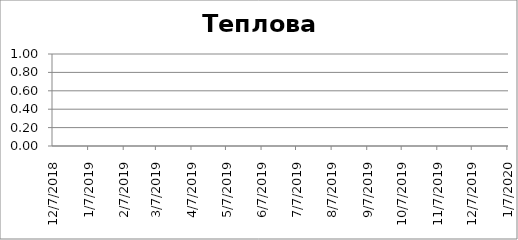
| Category | Теплова енергія |
|---|---|
| 12/7/18 | 0 |
| 12/13/18 | 0 |
| 12/19/18 | 0 |
| 12/25/18 | 0 |
| 12/31/18 | 0 |
| 1/6/19 | 0 |
| 1/12/19 | 0 |
| 1/18/19 | 0 |
| 1/24/19 | 0 |
| 1/30/19 | 0 |
| 2/5/19 | 0 |
| 2/11/19 | 0 |
| 2/17/19 | 0 |
| 2/23/19 | 0 |
| 3/1/19 | 0 |
| 3/7/19 | 0 |
| 3/13/19 | 0 |
| 3/19/19 | 0 |
| 3/25/19 | 0 |
| 3/31/19 | 0 |
| 4/6/19 | 0 |
| 4/12/19 | 0 |
| 4/18/19 | 0 |
| 4/24/19 | 0 |
| 4/30/19 | 0 |
| 5/6/19 | 0 |
| 5/12/19 | 0 |
| 5/18/19 | 0 |
| 5/24/19 | 0 |
| 5/30/19 | 0 |
| 6/5/19 | 0 |
| 6/11/19 | 0 |
| 6/17/19 | 0 |
| 6/23/19 | 0 |
| 6/29/19 | 0 |
| 7/5/19 | 0 |
| 7/11/19 | 0 |
| 7/17/19 | 0 |
| 7/23/19 | 0 |
| 7/29/19 | 0 |
| 8/4/19 | 0 |
| 8/10/19 | 0 |
| 8/16/19 | 0 |
| 8/22/19 | 0 |
| 8/28/19 | 0 |
| 9/3/19 | 0 |
| 9/9/19 | 0 |
| 9/15/19 | 0 |
| 9/21/19 | 0 |
| 9/27/19 | 0 |
| 10/3/19 | 0 |
| 10/9/19 | 0 |
| 10/15/19 | 0 |
| 10/21/19 | 0 |
| 10/27/19 | 0 |
| 11/2/19 | 0 |
| 11/8/19 | 0 |
| 11/14/19 | 0 |
| 11/20/19 | 0 |
| 11/26/19 | 0 |
| 12/2/19 | 0 |
| 12/8/19 | 0 |
| 12/14/19 | 0 |
| 12/20/19 | 0 |
| 12/26/19 | 0 |
| 1/1/20 | 0 |
| 1/7/20 | 0 |